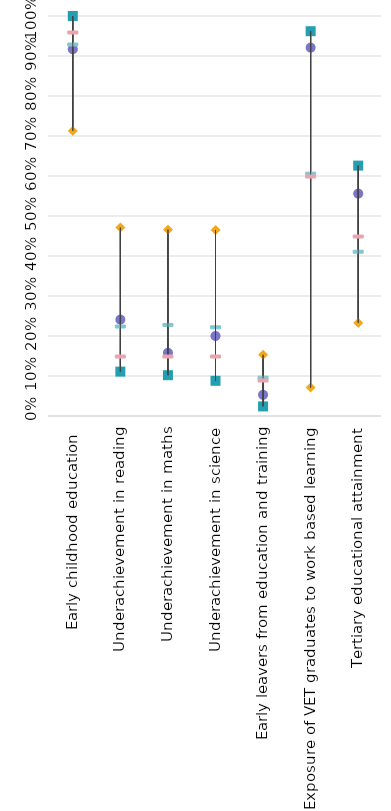
| Category | Netherlands | Strongest performer | Weakest performer | EU average | EU target |
|---|---|---|---|---|---|
| Early childhood education  | 0.917 | 1 | 0.713 | 0.93 | 0.96 |
| Underachievement in reading | 0.241 | 0.111 | 0.471 | 0.225 | 0.15 |
| Underachievement in maths | 0.158 | 0.102 | 0.466 | 0.229 | 0.15 |
| Underachievement in science | 0.2 | 0.088 | 0.465 | 0.223 | 0.15 |
| Early leavers from education and training | 0.053 | 0.024 | 0.153 | 0.097 | 0.09 |
| Exposure of VET graduates to work based learning  | 0.921 | 0.962 | 0.071 | 0.607 | 0.6 |
| Tertiary educational attainment | 0.556 | 0.626 | 0.233 | 0.412 | 0.45 |